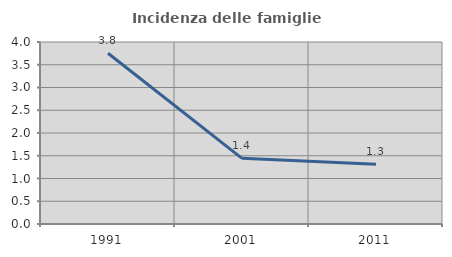
| Category | Incidenza delle famiglie numerose |
|---|---|
| 1991.0 | 3.752 |
| 2001.0 | 1.443 |
| 2011.0 | 1.316 |